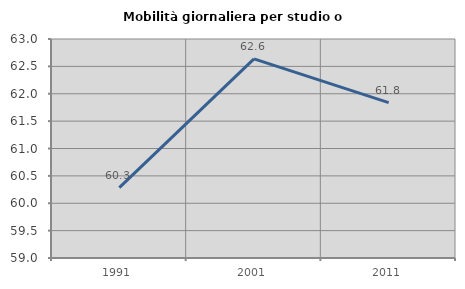
| Category | Mobilità giornaliera per studio o lavoro |
|---|---|
| 1991.0 | 60.287 |
| 2001.0 | 62.637 |
| 2011.0 | 61.838 |